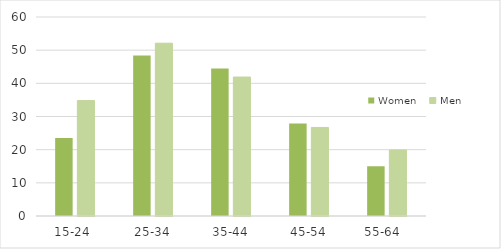
| Category | Women | Men |
|---|---|---|
| 15-24  | 23.5 | 34.8 |
| 25-34 | 48.4 | 52.1 |
| 35-44 | 44.5 | 41.9 |
| 45-54 | 27.9 | 26.7 |
| 55-64   | 15 | 19.9 |